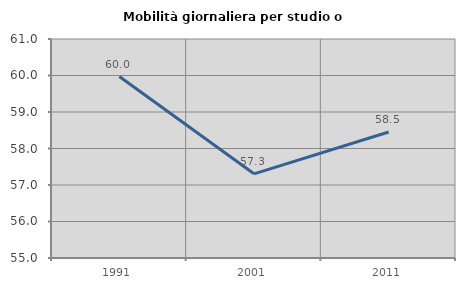
| Category | Mobilità giornaliera per studio o lavoro |
|---|---|
| 1991.0 | 59.972 |
| 2001.0 | 57.306 |
| 2011.0 | 58.453 |